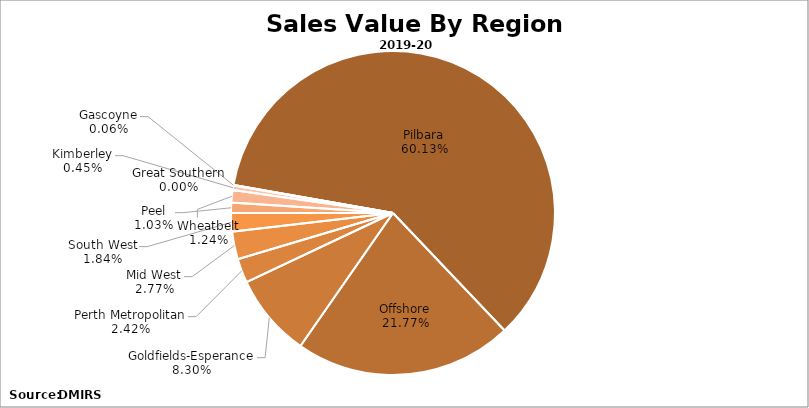
| Category | Series 0 |
|---|---|
| Pilbara | 103262990315.952 |
| Offshore | 37377105642.01 |
| Goldfields-Esperance | 14252408428.108 |
| Perth Metropolitan | 4150552154.753 |
| Mid West | 4757259168.291 |
| South West | 3154339332.67 |
| Peel | 1768944111 |
| Wheatbelt | 2135491074.815 |
| Kimberley | 765041859.047 |
| Gascoyne | 97795242 |
| Great Southern | 7302294 |